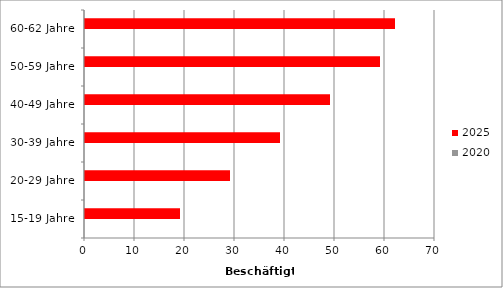
| Category | 2020 | 2025 |
|---|---|---|
| 15-19 Jahre | 7 | 0 |
| 20-29 Jahre | 6 | 8 |
| 30-39 Jahre | 15 | 10 |
| 40-49 Jahre | 115 | 121 |
| 50-59 Jahre | 3 | 9 |
| 60-62 Jahre | 3 | 1.2 |